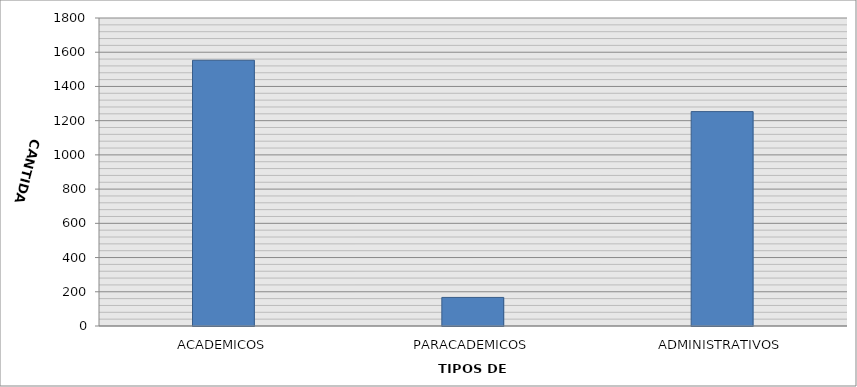
| Category | CANTIDAD |
|---|---|
| ACADEMICOS | 1553 |
| PARACADEMICOS | 167 |
| ADMINISTRATIVOS | 1253 |